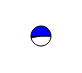
| Category | Series 0 |
|---|---|
| 0 | 13966 |
| 1 | 15319 |